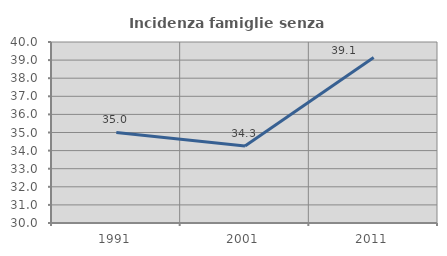
| Category | Incidenza famiglie senza nuclei |
|---|---|
| 1991.0 | 35.003 |
| 2001.0 | 34.259 |
| 2011.0 | 39.145 |